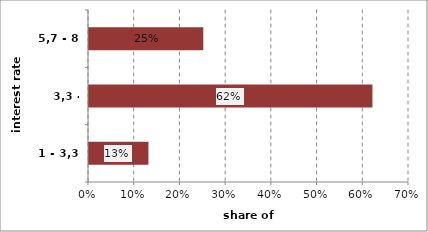
| Category | Series 0 |
|---|---|
| 1 - 3,3 | 0.13 |
| 3,3 - 5,7 | 0.62 |
| 5,7 - 8 | 0.25 |